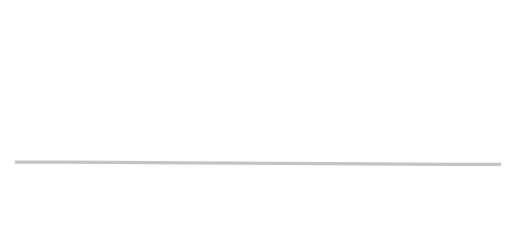
| Category | S1 | S2 | S3 |
|---|---|---|---|
| 0.0 | 1270 | 30 | 630 |
| 10.0 | 1270 | 30 | 630 |
| 90.0 | 1290 | 30 | 610 |
| 100.0 | 1290 | 30 | 610 |